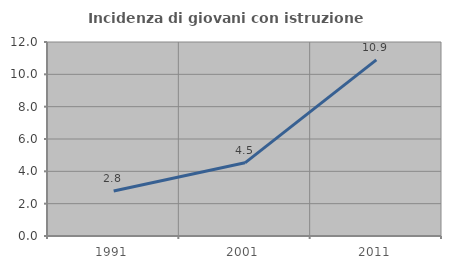
| Category | Incidenza di giovani con istruzione universitaria |
|---|---|
| 1991.0 | 2.789 |
| 2001.0 | 4.527 |
| 2011.0 | 10.897 |